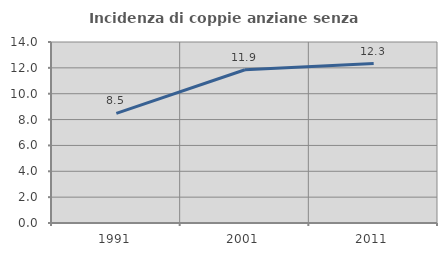
| Category | Incidenza di coppie anziane senza figli  |
|---|---|
| 1991.0 | 8.485 |
| 2001.0 | 11.856 |
| 2011.0 | 12.336 |